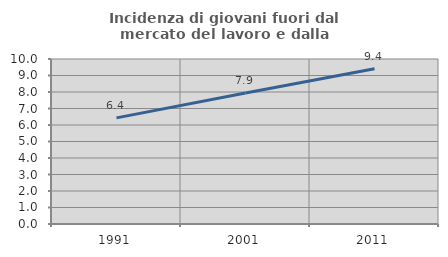
| Category | Incidenza di giovani fuori dal mercato del lavoro e dalla formazione  |
|---|---|
| 1991.0 | 6.433 |
| 2001.0 | 7.937 |
| 2011.0 | 9.408 |